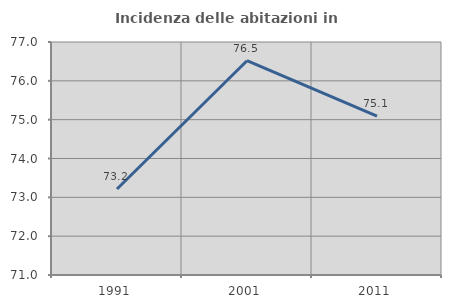
| Category | Incidenza delle abitazioni in proprietà  |
|---|---|
| 1991.0 | 73.214 |
| 2001.0 | 76.518 |
| 2011.0 | 75.089 |